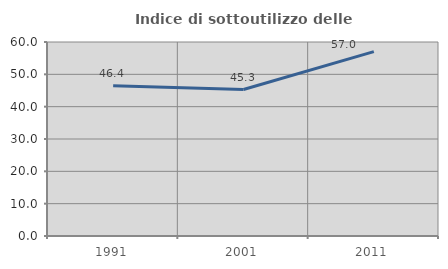
| Category | Indice di sottoutilizzo delle abitazioni  |
|---|---|
| 1991.0 | 46.434 |
| 2001.0 | 45.295 |
| 2011.0 | 57.019 |